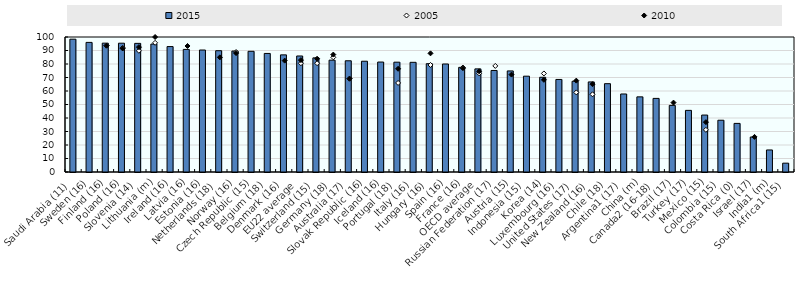
| Category | 2015 |
|---|---|
| Saudi Arabia (11) | 98.39 |
| Sweden (16) | 96.004 |
| Finland (16) | 95.448 |
| Poland (16) | 95.412 |
| Slovenia (14) | 95.284 |
| Lithuania (m) | 94.774 |
| Ireland (16) | 92.913 |
| Latvia (16) | 90.818 |
| Estonia (16) | 90.358 |
| Netherlands (18) | 89.856 |
| Norway (16) | 89.599 |
| Czech Republic (15) | 89.404 |
| Belgium (18) | 87.814 |
| Denmark (16) | 86.765 |
| EU22 average | 85.939 |
| Switzerland (15) | 84.539 |
| Germany (18) | 82.858 |
| Australia (17) | 82.388 |
| Slovak Republic (16) | 82.056 |
| Iceland (16) | 81.45 |
| Portugal (18) | 81.35 |
| Italy (16) | 81.241 |
| Hungary (16) | 80.243 |
| Spain (16) | 80.007 |
| France (16) | 77.519 |
| OECD average | 76.379 |
| Russian Federation (17) | 75.21 |
| Austria (15) | 74.869 |
| Indonesia (15) | 70.973 |
| Korea (14) | 70.182 |
| Luxembourg (16) | 68.559 |
| United States (17) | 67.202 |
| New Zealand (16) | 66.719 |
| Chile (18) | 65.425 |
| Argentina1 (17) | 57.796 |
| China (m) | 55.667 |
| Canada2 (16-18) | 54.518 |
| Brazil (17) | 49.351 |
| Turkey (17) | 45.659 |
| Mexico (15) | 42.181 |
| Colombia (15) | 38.351 |
| Costa Rica (0) | 35.997 |
| Israel (17) | 25.909 |
| India1 (m) | 16.331 |
| South Africa1 (15) | 6.54 |